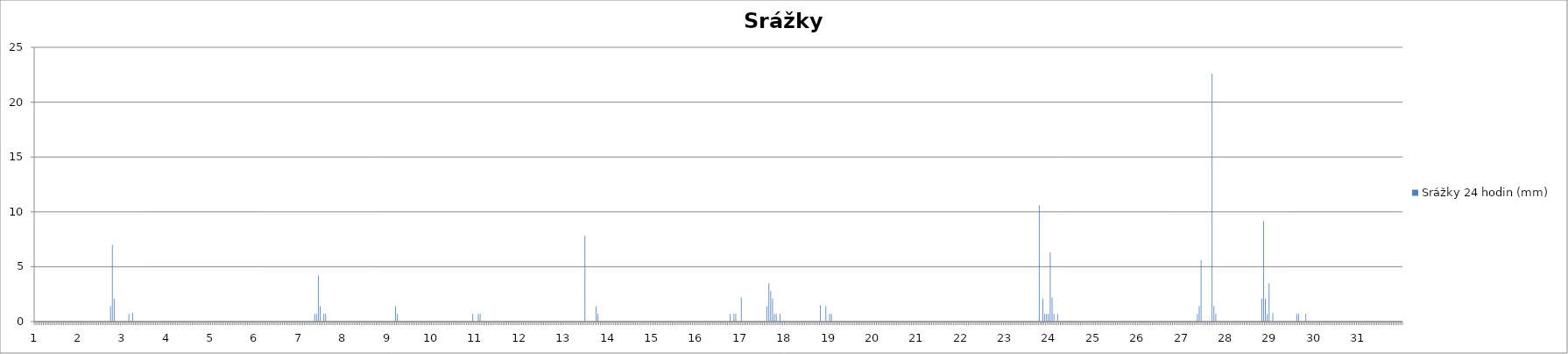
| Category | Srážky 24 hodin (mm) |
|---|---|
| 0 | 0 |
| 1 | 0 |
| 2 | 0 |
| 3 | 0 |
| 4 | 0 |
| 5 | 0 |
| 6 | 0 |
| 7 | 0 |
| 8 | 0 |
| 9 | 0 |
| 10 | 0 |
| 11 | 0 |
| 12 | 0 |
| 13 | 0 |
| 14 | 0 |
| 15 | 0 |
| 16 | 0 |
| 17 | 0 |
| 18 | 0 |
| 19 | 0 |
| 20 | 0 |
| 21 | 0 |
| 22 | 0 |
| 23 | 0 |
| 24 | 0 |
| 25 | 0 |
| 26 | 0 |
| 27 | 0 |
| 28 | 0 |
| 29 | 0 |
| 30 | 0 |
| 31 | 0 |
| 32 | 0 |
| 33 | 0 |
| 34 | 0 |
| 35 | 0 |
| 36 | 0 |
| 37 | 0 |
| 38 | 0 |
| 39 | 0 |
| 40 | 0 |
| 41 | 1.4 |
| 42 | 7 |
| 43 | 2.1 |
| 44 | 0 |
| 45 | 0 |
| 46 | 0 |
| 47 | 0 |
| 48 | 0 |
| 49 | 0 |
| 50 | 0 |
| 51 | 0.7 |
| 52 | 0 |
| 53 | 0.8 |
| 54 | 0 |
| 55 | 0 |
| 56 | 0 |
| 57 | 0 |
| 58 | 0 |
| 59 | 0 |
| 60 | 0 |
| 61 | 0 |
| 62 | 0 |
| 63 | 0 |
| 64 | 0 |
| 65 | 0 |
| 66 | 0 |
| 67 | 0 |
| 68 | 0 |
| 69 | 0 |
| 70 | 0 |
| 71 | 0 |
| 72 | 0 |
| 73 | 0 |
| 74 | 0 |
| 75 | 0 |
| 76 | 0 |
| 77 | 0 |
| 78 | 0 |
| 79 | 0 |
| 80 | 0 |
| 81 | 0 |
| 82 | 0 |
| 83 | 0 |
| 84 | 0 |
| 85 | 0 |
| 86 | 0 |
| 87 | 0 |
| 88 | 0 |
| 89 | 0 |
| 90 | 0 |
| 91 | 0 |
| 92 | 0 |
| 93 | 0 |
| 94 | 0 |
| 95 | 0 |
| 96 | 0 |
| 97 | 0 |
| 98 | 0 |
| 99 | 0 |
| 100 | 0 |
| 101 | 0 |
| 102 | 0 |
| 103 | 0 |
| 104 | 0 |
| 105 | 0 |
| 106 | 0 |
| 107 | 0 |
| 108 | 0 |
| 109 | 0 |
| 110 | 0 |
| 111 | 0 |
| 112 | 0 |
| 113 | 0 |
| 114 | 0 |
| 115 | 0 |
| 116 | 0 |
| 117 | 0 |
| 118 | 0 |
| 119 | 0 |
| 120 | 0 |
| 121 | 0 |
| 122 | 0 |
| 123 | 0 |
| 124 | 0 |
| 125 | 0 |
| 126 | 0 |
| 127 | 0 |
| 128 | 0 |
| 129 | 0 |
| 130 | 0 |
| 131 | 0 |
| 132 | 0 |
| 133 | 0 |
| 134 | 0 |
| 135 | 0 |
| 136 | 0 |
| 137 | 0 |
| 138 | 0 |
| 139 | 0 |
| 140 | 0 |
| 141 | 0 |
| 142 | 0 |
| 143 | 0 |
| 144 | 0 |
| 145 | 0 |
| 146 | 0 |
| 147 | 0 |
| 148 | 0 |
| 149 | 0 |
| 150 | 0 |
| 151 | 0 |
| 152 | 0.7 |
| 153 | 0.7 |
| 154 | 4.2 |
| 155 | 1.4 |
| 156 | 0 |
| 157 | 0.7 |
| 158 | 0.7 |
| 159 | 0 |
| 160 | 0 |
| 161 | 0 |
| 162 | 0 |
| 163 | 0 |
| 164 | 0 |
| 165 | 0 |
| 166 | 0 |
| 167 | 0 |
| 168 | 0 |
| 169 | 0 |
| 170 | 0 |
| 171 | 0 |
| 172 | 0 |
| 173 | 0 |
| 174 | 0 |
| 175 | 0 |
| 176 | 0 |
| 177 | 0 |
| 178 | 0 |
| 179 | 0 |
| 180 | 0 |
| 181 | 0 |
| 182 | 0 |
| 183 | 0 |
| 184 | 0 |
| 185 | 0 |
| 186 | 0 |
| 187 | 0 |
| 188 | 0 |
| 189 | 0 |
| 190 | 0 |
| 191 | 0 |
| 192 | 0 |
| 193 | 0 |
| 194 | 0 |
| 195 | 0 |
| 196 | 1.4 |
| 197 | 0.7 |
| 198 | 0 |
| 199 | 0 |
| 200 | 0 |
| 201 | 0 |
| 202 | 0 |
| 203 | 0 |
| 204 | 0 |
| 205 | 0 |
| 206 | 0 |
| 207 | 0 |
| 208 | 0 |
| 209 | 0 |
| 210 | 0 |
| 211 | 0 |
| 212 | 0 |
| 213 | 0 |
| 214 | 0 |
| 215 | 0 |
| 216 | 0 |
| 217 | 0 |
| 218 | 0 |
| 219 | 0 |
| 220 | 0 |
| 221 | 0 |
| 222 | 0 |
| 223 | 0 |
| 224 | 0 |
| 225 | 0 |
| 226 | 0 |
| 227 | 0 |
| 228 | 0 |
| 229 | 0 |
| 230 | 0 |
| 231 | 0 |
| 232 | 0 |
| 233 | 0 |
| 234 | 0 |
| 235 | 0 |
| 236 | 0 |
| 237 | 0 |
| 238 | 0.7 |
| 239 | 0 |
| 240 | 0 |
| 241 | 0.7 |
| 242 | 0.7 |
| 243 | 0 |
| 244 | 0 |
| 245 | 0 |
| 246 | 0 |
| 247 | 0 |
| 248 | 0 |
| 249 | 0 |
| 250 | 0 |
| 251 | 0 |
| 252 | 0 |
| 253 | 0 |
| 254 | 0 |
| 255 | 0 |
| 256 | 0 |
| 257 | 0 |
| 258 | 0 |
| 259 | 0 |
| 260 | 0 |
| 261 | 0 |
| 262 | 0 |
| 263 | 0 |
| 264 | 0 |
| 265 | 0 |
| 266 | 0 |
| 267 | 0 |
| 268 | 0 |
| 269 | 0 |
| 270 | 0 |
| 271 | 0 |
| 272 | 0 |
| 273 | 0 |
| 274 | 0 |
| 275 | 0 |
| 276 | 0 |
| 277 | 0 |
| 278 | 0 |
| 279 | 0 |
| 280 | 0 |
| 281 | 0 |
| 282 | 0 |
| 283 | 0 |
| 284 | 0 |
| 285 | 0 |
| 286 | 0 |
| 287 | 0 |
| 288 | 0 |
| 289 | 0 |
| 290 | 0 |
| 291 | 0 |
| 292 | 0 |
| 293 | 0 |
| 294 | 0 |
| 295 | 0 |
| 296 | 0 |
| 297 | 0 |
| 298 | 0 |
| 299 | 7.8 |
| 300 | 0 |
| 301 | 0 |
| 302 | 0 |
| 303 | 0 |
| 304 | 0 |
| 305 | 1.4 |
| 306 | 0.7 |
| 307 | 0 |
| 308 | 0 |
| 309 | 0 |
| 310 | 0 |
| 311 | 0 |
| 312 | 0 |
| 313 | 0 |
| 314 | 0 |
| 315 | 0 |
| 316 | 0 |
| 317 | 0 |
| 318 | 0 |
| 319 | 0 |
| 320 | 0 |
| 321 | 0 |
| 322 | 0 |
| 323 | 0 |
| 324 | 0 |
| 325 | 0 |
| 326 | 0 |
| 327 | 0 |
| 328 | 0 |
| 329 | 0 |
| 330 | 0 |
| 331 | 0 |
| 332 | 0 |
| 333 | 0 |
| 334 | 0 |
| 335 | 0 |
| 336 | 0 |
| 337 | 0 |
| 338 | 0 |
| 339 | 0 |
| 340 | 0 |
| 341 | 0 |
| 342 | 0 |
| 343 | 0 |
| 344 | 0 |
| 345 | 0 |
| 346 | 0 |
| 347 | 0 |
| 348 | 0 |
| 349 | 0 |
| 350 | 0 |
| 351 | 0 |
| 352 | 0 |
| 353 | 0 |
| 354 | 0 |
| 355 | 0 |
| 356 | 0 |
| 357 | 0 |
| 358 | 0 |
| 359 | 0 |
| 360 | 0 |
| 361 | 0 |
| 362 | 0 |
| 363 | 0 |
| 364 | 0 |
| 365 | 0 |
| 366 | 0 |
| 367 | 0 |
| 368 | 0 |
| 369 | 0 |
| 370 | 0 |
| 371 | 0 |
| 372 | 0 |
| 373 | 0 |
| 374 | 0 |
| 375 | 0 |
| 376 | 0 |
| 377 | 0 |
| 378 | 0.7 |
| 379 | 0 |
| 380 | 0.7 |
| 381 | 0.7 |
| 382 | 0 |
| 383 | 0 |
| 384 | 2.2 |
| 385 | 0 |
| 386 | 0 |
| 387 | 0 |
| 388 | 0 |
| 389 | 0 |
| 390 | 0 |
| 391 | 0 |
| 392 | 0 |
| 393 | 0 |
| 394 | 0 |
| 395 | 0 |
| 396 | 0 |
| 397 | 0 |
| 398 | 1.4 |
| 399 | 3.5 |
| 400 | 2.8 |
| 401 | 2.1 |
| 402 | 0.7 |
| 403 | 0.7 |
| 404 | 0 |
| 405 | 0.7 |
| 406 | 0 |
| 407 | 0 |
| 408 | 0 |
| 409 | 0 |
| 410 | 0 |
| 411 | 0 |
| 412 | 0 |
| 413 | 0 |
| 414 | 0 |
| 415 | 0 |
| 416 | 0 |
| 417 | 0 |
| 418 | 0 |
| 419 | 0 |
| 420 | 0 |
| 421 | 0 |
| 422 | 0 |
| 423 | 0 |
| 424 | 0 |
| 425 | 0 |
| 426 | 0 |
| 427 | 1.5 |
| 428 | 0 |
| 429 | 0 |
| 430 | 1.4 |
| 431 | 0 |
| 432 | 0.7 |
| 433 | 0.7 |
| 434 | 0 |
| 435 | 0 |
| 436 | 0 |
| 437 | 0 |
| 438 | 0 |
| 439 | 0 |
| 440 | 0 |
| 441 | 0 |
| 442 | 0 |
| 443 | 0 |
| 444 | 0 |
| 445 | 0 |
| 446 | 0 |
| 447 | 0 |
| 448 | 0 |
| 449 | 0 |
| 450 | 0 |
| 451 | 0 |
| 452 | 0 |
| 453 | 0 |
| 454 | 0 |
| 455 | 0 |
| 456 | 0 |
| 457 | 0 |
| 458 | 0 |
| 459 | 0 |
| 460 | 0 |
| 461 | 0 |
| 462 | 0 |
| 463 | 0 |
| 464 | 0 |
| 465 | 0 |
| 466 | 0 |
| 467 | 0 |
| 468 | 0 |
| 469 | 0 |
| 470 | 0 |
| 471 | 0 |
| 472 | 0 |
| 473 | 0 |
| 474 | 0 |
| 475 | 0 |
| 476 | 0 |
| 477 | 0 |
| 478 | 0 |
| 479 | 0 |
| 480 | 0 |
| 481 | 0 |
| 482 | 0 |
| 483 | 0 |
| 484 | 0 |
| 485 | 0 |
| 486 | 0 |
| 487 | 0 |
| 488 | 0 |
| 489 | 0 |
| 490 | 0 |
| 491 | 0 |
| 492 | 0 |
| 493 | 0 |
| 494 | 0 |
| 495 | 0 |
| 496 | 0 |
| 497 | 0 |
| 498 | 0 |
| 499 | 0 |
| 500 | 0 |
| 501 | 0 |
| 502 | 0 |
| 503 | 0 |
| 504 | 0 |
| 505 | 0 |
| 506 | 0 |
| 507 | 0 |
| 508 | 0 |
| 509 | 0 |
| 510 | 0 |
| 511 | 0 |
| 512 | 0 |
| 513 | 0 |
| 514 | 0 |
| 515 | 0 |
| 516 | 0 |
| 517 | 0 |
| 518 | 0 |
| 519 | 0 |
| 520 | 0 |
| 521 | 0 |
| 522 | 0 |
| 523 | 0 |
| 524 | 0 |
| 525 | 0 |
| 526 | 0 |
| 527 | 0 |
| 528 | 0 |
| 529 | 0 |
| 530 | 0 |
| 531 | 0 |
| 532 | 0 |
| 533 | 0 |
| 534 | 0 |
| 535 | 0 |
| 536 | 0 |
| 537 | 0 |
| 538 | 0 |
| 539 | 0 |
| 540 | 0 |
| 541 | 0 |
| 542 | 0 |
| 543 | 0 |
| 544 | 0 |
| 545 | 0 |
| 546 | 10.6 |
| 547 | 0 |
| 548 | 2.1 |
| 549 | 0.7 |
| 550 | 0.7 |
| 551 | 0.7 |
| 552 | 6.3 |
| 553 | 2.2 |
| 554 | 0.7 |
| 555 | 0 |
| 556 | 0.7 |
| 557 | 0 |
| 558 | 0 |
| 559 | 0 |
| 560 | 0 |
| 561 | 0 |
| 562 | 0 |
| 563 | 0 |
| 564 | 0 |
| 565 | 0 |
| 566 | 0 |
| 567 | 0 |
| 568 | 0 |
| 569 | 0 |
| 570 | 0 |
| 571 | 0 |
| 572 | 0 |
| 573 | 0 |
| 574 | 0 |
| 575 | 0 |
| 576 | 0 |
| 577 | 0 |
| 578 | 0 |
| 579 | 0 |
| 580 | 0 |
| 581 | 0 |
| 582 | 0 |
| 583 | 0 |
| 584 | 0 |
| 585 | 0 |
| 586 | 0 |
| 587 | 0 |
| 588 | 0 |
| 589 | 0 |
| 590 | 0 |
| 591 | 0 |
| 592 | 0 |
| 593 | 0 |
| 594 | 0 |
| 595 | 0 |
| 596 | 0 |
| 597 | 0 |
| 598 | 0 |
| 599 | 0 |
| 600 | 0 |
| 601 | 0 |
| 602 | 0 |
| 603 | 0 |
| 604 | 0 |
| 605 | 0 |
| 606 | 0 |
| 607 | 0 |
| 608 | 0 |
| 609 | 0 |
| 610 | 0 |
| 611 | 0 |
| 612 | 0 |
| 613 | 0 |
| 614 | 0 |
| 615 | 0 |
| 616 | 0 |
| 617 | 0 |
| 618 | 0 |
| 619 | 0 |
| 620 | 0 |
| 621 | 0 |
| 622 | 0 |
| 623 | 0 |
| 624 | 0 |
| 625 | 0 |
| 626 | 0 |
| 627 | 0 |
| 628 | 0 |
| 629 | 0 |
| 630 | 0 |
| 631 | 0 |
| 632 | 0.7 |
| 633 | 1.4 |
| 634 | 5.6 |
| 635 | 0 |
| 636 | 0 |
| 637 | 0 |
| 638 | 0 |
| 639 | 0 |
| 640 | 22.6 |
| 641 | 1.4 |
| 642 | 0.7 |
| 643 | 0 |
| 644 | 0 |
| 645 | 0 |
| 646 | 0 |
| 647 | 0 |
| 648 | 0 |
| 649 | 0 |
| 650 | 0 |
| 651 | 0 |
| 652 | 0 |
| 653 | 0 |
| 654 | 0 |
| 655 | 0 |
| 656 | 0 |
| 657 | 0 |
| 658 | 0 |
| 659 | 0 |
| 660 | 0 |
| 661 | 0 |
| 662 | 0 |
| 663 | 0 |
| 664 | 0 |
| 665 | 0 |
| 666 | 0 |
| 667 | 2.1 |
| 668 | 9.2 |
| 669 | 2.1 |
| 670 | 0.7 |
| 671 | 3.5 |
| 672 | 0 |
| 673 | 0.8 |
| 674 | 0 |
| 675 | 0 |
| 676 | 0 |
| 677 | 0 |
| 678 | 0 |
| 679 | 0 |
| 680 | 0 |
| 681 | 0 |
| 682 | 0 |
| 683 | 0 |
| 684 | 0 |
| 685 | 0 |
| 686 | 0.7 |
| 687 | 0.7 |
| 688 | 0 |
| 689 | 0 |
| 690 | 0 |
| 691 | 0.7 |
| 692 | 0 |
| 693 | 0 |
| 694 | 0 |
| 695 | 0 |
| 696 | 0 |
| 697 | 0 |
| 698 | 0 |
| 699 | 0 |
| 700 | 0 |
| 701 | 0 |
| 702 | 0 |
| 703 | 0 |
| 704 | 0 |
| 705 | 0 |
| 706 | 0 |
| 707 | 0 |
| 708 | 0 |
| 709 | 0 |
| 710 | 0 |
| 711 | 0 |
| 712 | 0 |
| 713 | 0 |
| 714 | 0 |
| 715 | 0 |
| 716 | 0 |
| 717 | 0 |
| 718 | 0 |
| 719 | 0 |
| 720 | 0 |
| 721 | 0 |
| 722 | 0 |
| 723 | 0 |
| 724 | 0 |
| 725 | 0 |
| 726 | 0 |
| 727 | 0 |
| 728 | 0 |
| 729 | 0 |
| 730 | 0 |
| 731 | 0 |
| 732 | 0 |
| 733 | 0 |
| 734 | 0 |
| 735 | 0 |
| 736 | 0 |
| 737 | 0 |
| 738 | 0 |
| 739 | 0 |
| 740 | 0 |
| 741 | 0 |
| 742 | 0 |
| 743 | 0 |